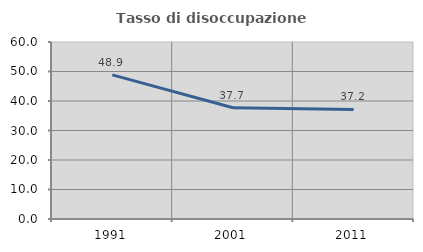
| Category | Tasso di disoccupazione giovanile  |
|---|---|
| 1991.0 | 48.859 |
| 2001.0 | 37.694 |
| 2011.0 | 37.152 |